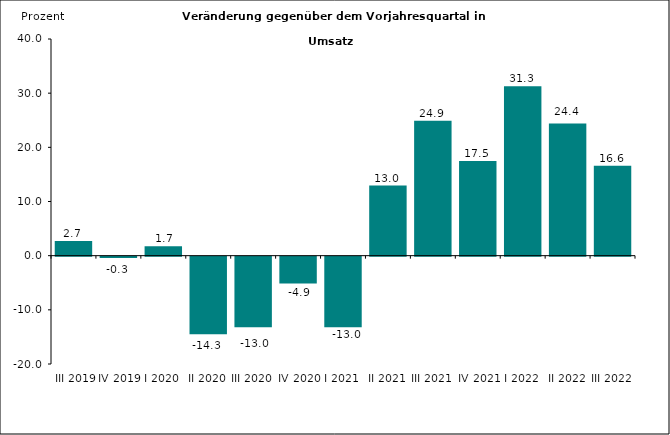
| Category | Series 0 |
|---|---|
|  III 2019 | 2.73 |
| IV 2019 | -0.265 |
| I 2020 | 1.721 |
| II 2020 | -14.324 |
| III 2020 | -13.033 |
| IV 2020 | -4.938 |
| I 2021 | -13.038 |
| II 2021 | 12.95 |
| III 2021 | 24.9 |
| IV 2021 | 17.5 |
| I 2022 | 31.3 |
| II 2022 | 24.4 |
| III 2022 | 16.6 |